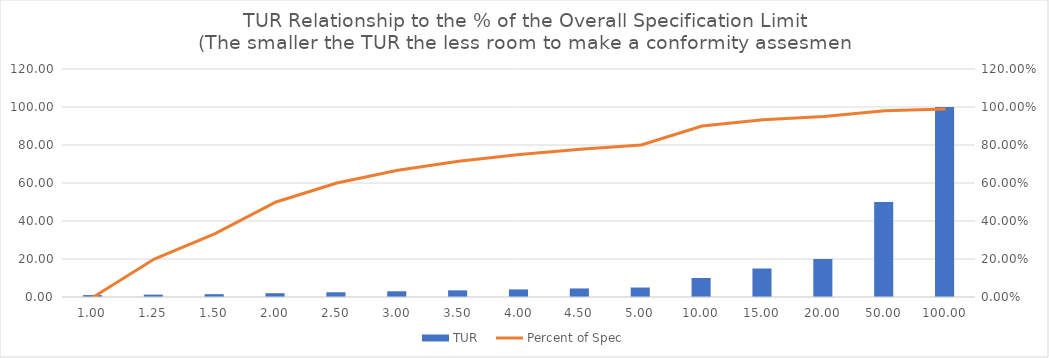
| Category | TUR  |
|---|---|
| 1.0 | 1 |
| 1.25 | 1.25 |
| 1.5 | 1.5 |
| 2.0 | 2 |
| 2.5 | 2.5 |
| 3.0 | 3 |
| 3.5 | 3.5 |
| 4.0 | 4 |
| 4.5 | 4.5 |
| 5.0 | 5 |
| 10.0 | 10 |
| 15.0 | 15 |
| 20.0 | 20 |
| 50.0 | 50 |
| 100.0 | 100 |